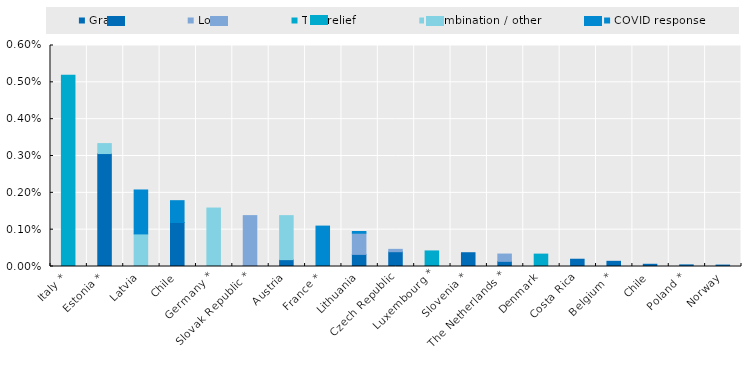
| Category | Grant | Loan | Tax relief | Combination / other | COVID response |
|---|---|---|---|---|---|
| Italy * | 0 | 0 | 0.005 | 0 | 0 |
| Estonia * | 0.003 | 0 | 0 | 0 | 0 |
| Latvia | 0 | 0 | 0 | 0.001 | 0.001 |
| Chile | 0.001 | 0 | 0 | 0 | 0.001 |
| Germany * | 0 | 0 | 0 | 0.002 | 0 |
| Slovak Republic * | 0 | 0.001 | 0 | 0 | 0 |
| Austria | 0 | 0 | 0 | 0.001 | 0 |
| France * | 0 | 0 | 0 | 0 | 0.001 |
| Lithuania | 0 | 0.001 | 0 | 0 | 0 |
| Czech Republic | 0 | 0 | 0 | 0 | 0 |
| Luxembourg * | 0 | 0 | 0 | 0 | 0 |
| Slovenia * | 0 | 0 | 0 | 0 | 0 |
| The Netherlands * | 0 | 0 | 0 | 0 | 0 |
| Denmark | 0 | 0 | 0 | 0 | 0 |
| Costa Rica | 0 | 0 | 0 | 0 | 0 |
| Belgium * | 0 | 0 | 0 | 0 | 0 |
| Chile | 0 | 0 | 0 | 0 | 0 |
| Poland * | 0 | 0 | 0 | 0 | 0 |
| Norway | 0 | 0 | 0 | 0 | 0 |